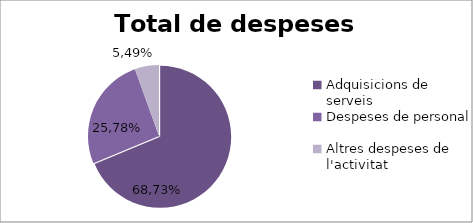
| Category | Series 0 |
|---|---|
| Adquisicions de serveis | 68.73 |
| Despeses de personal | 25.78 |
| Altres despeses de l'activitat | 5.49 |